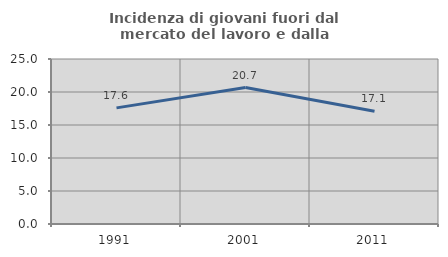
| Category | Incidenza di giovani fuori dal mercato del lavoro e dalla formazione  |
|---|---|
| 1991.0 | 17.595 |
| 2001.0 | 20.667 |
| 2011.0 | 17.096 |